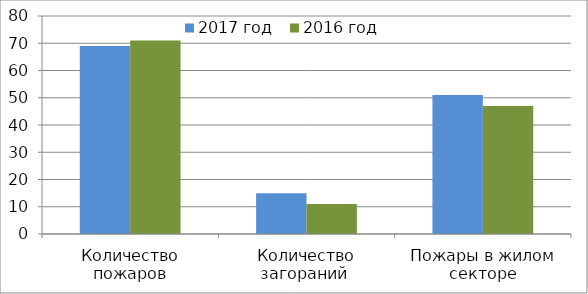
| Category | 2017 год | 2016 год |
|---|---|---|
| Количество пожаров | 69 | 71 |
| Количество загораний  | 15 | 11 |
| Пожары в жилом секторе | 51 | 47 |